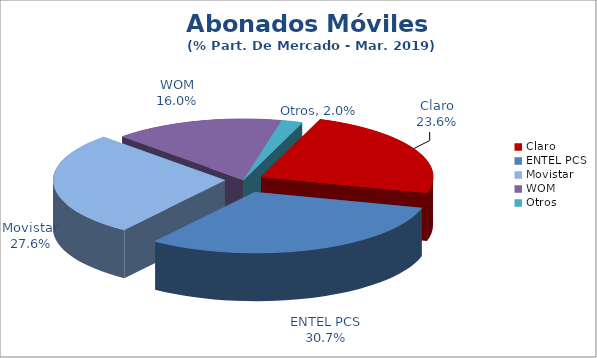
| Category | Series 0 |
|---|---|
| Claro | 0.236 |
| ENTEL PCS | 0.307 |
| Movistar | 0.276 |
| WOM | 0.16 |
| Otros | 0.02 |